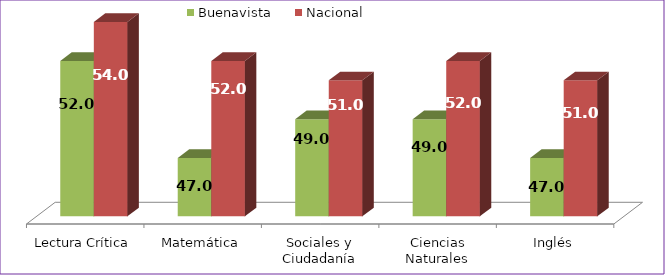
| Category | Buenavista | Nacional |
|---|---|---|
| Lectura Crítica | 52 | 54 |
| Matemática | 47 | 52 |
| Sociales y Ciudadanía | 49 | 51 |
| Ciencias Naturales | 49 | 52 |
| Inglés | 47 | 51 |